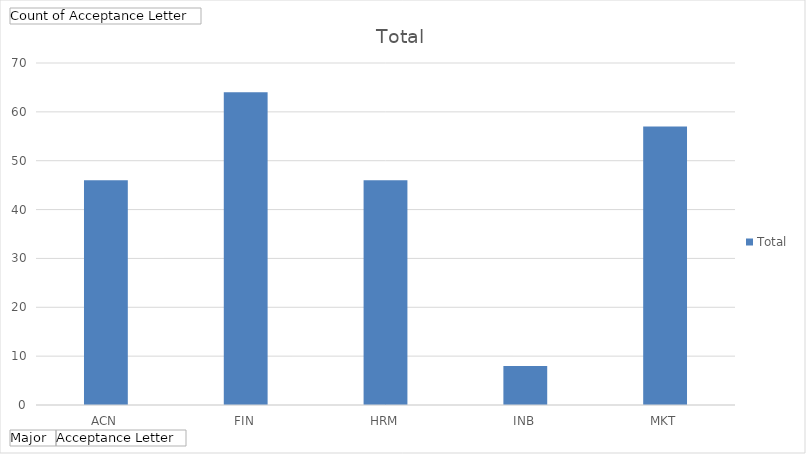
| Category | Total |
|---|---|
| ACN | 46 |
| FIN | 64 |
| HRM | 46 |
| INB | 8 |
| MKT | 57 |